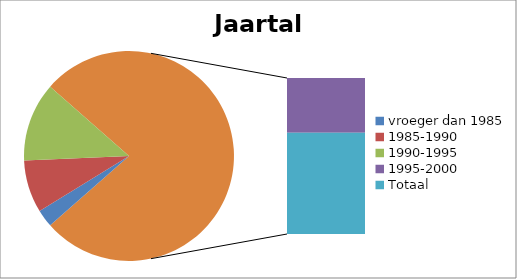
| Category | Aantal |
|---|---|
| vroeger dan 1985 | 2 |
| 1985-1990 | 6 |
| 1990-1995 | 9 |
| 1995-2000 | 20 |
| Totaal | 37 |